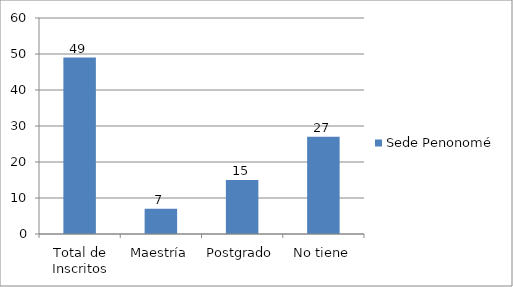
| Category | Sede Penonomé |
|---|---|
| Total de Inscritos | 49 |
| Maestría | 7 |
| Postgrado | 15 |
| No tiene | 27 |